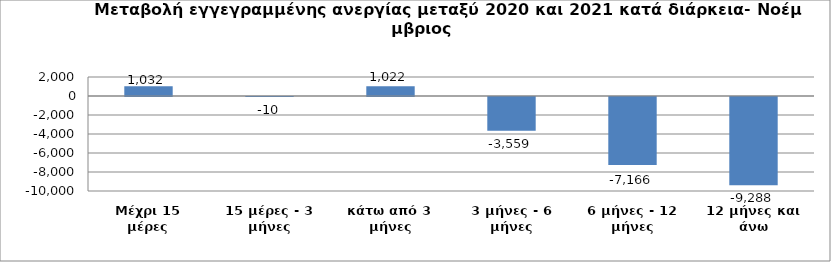
| Category | Series 0 |
|---|---|
| Μέχρι 15 μέρες | 1032 |
| 15 μέρες - 3 μήνες | -10 |
| κάτω από 3 μήνες | 1022 |
| 3 μήνες - 6 μήνες | -3559 |
| 6 μήνες - 12 μήνες | -7166 |
| 12 μήνες και άνω | -9288 |